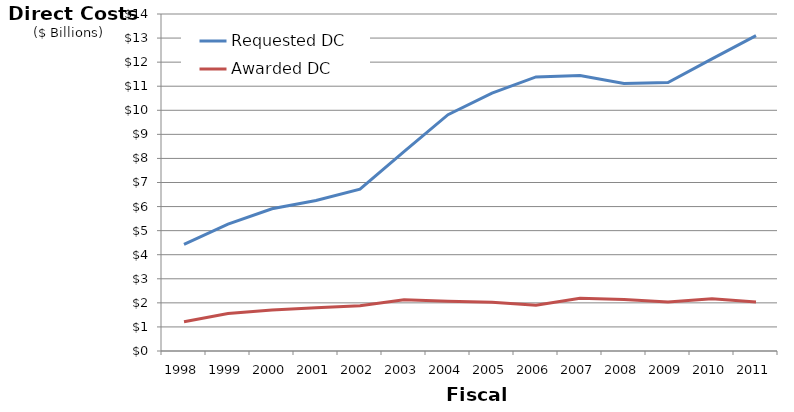
| Category |  Requested DC |  Awarded DC |
|---|---|---|
| 1998.0 | 4430214717 | 1211851762.14 |
| 1999.0 | 5268458395 | 1553396475.3 |
| 2000.0 | 5907260797 | 1699538815.66 |
| 2001.0 | 6253174304 | 1798889781.15 |
| 2002.0 | 6720658023 | 1878267534.04 |
| 2003.0 | 8282033218 | 2125346476.18 |
| 2004.0 | 9818527782 | 2069514620.68 |
| 2005.0 | 10714306584 | 2029993035.48 |
| 2006.0 | 11387017913 | 1905849289.08 |
| 2007.0 | 11447252457 | 2186641325.77 |
| 2008.0 | 11108775998 | 2143170747.84 |
| 2009.0 | 11156212912 | 2036597264.24 |
| 2010.0 | 12134627861 | 2165758241.36 |
| 2011.0 | 13098482444 | 2033250715.5 |